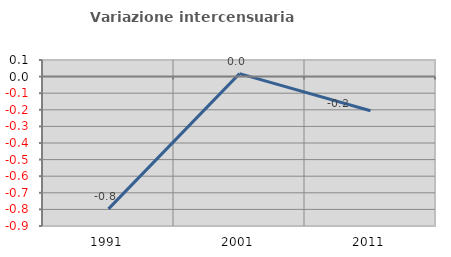
| Category | Variazione intercensuaria annua |
|---|---|
| 1991.0 | -0.797 |
| 2001.0 | 0.018 |
| 2011.0 | -0.206 |